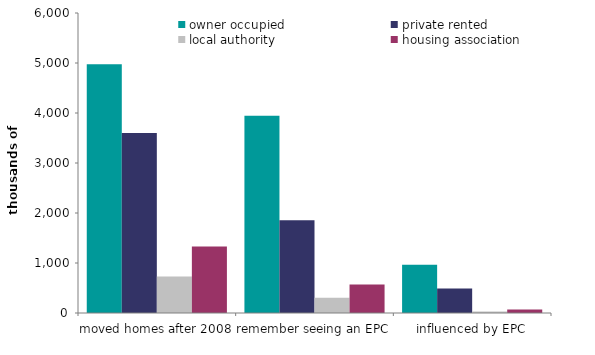
| Category | owner occupied | private rented | local authority | housing association |
|---|---|---|---|---|
| moved homes after 2008 | 4973.962 | 3600.044 | 730.05 | 1327.654 |
| remember seeing an EPC | 3945.733 | 1857.347 | 305.307 | 571.04 |
| influenced by EPC | 963.527 | 490.696 | 32.479 | 68.854 |